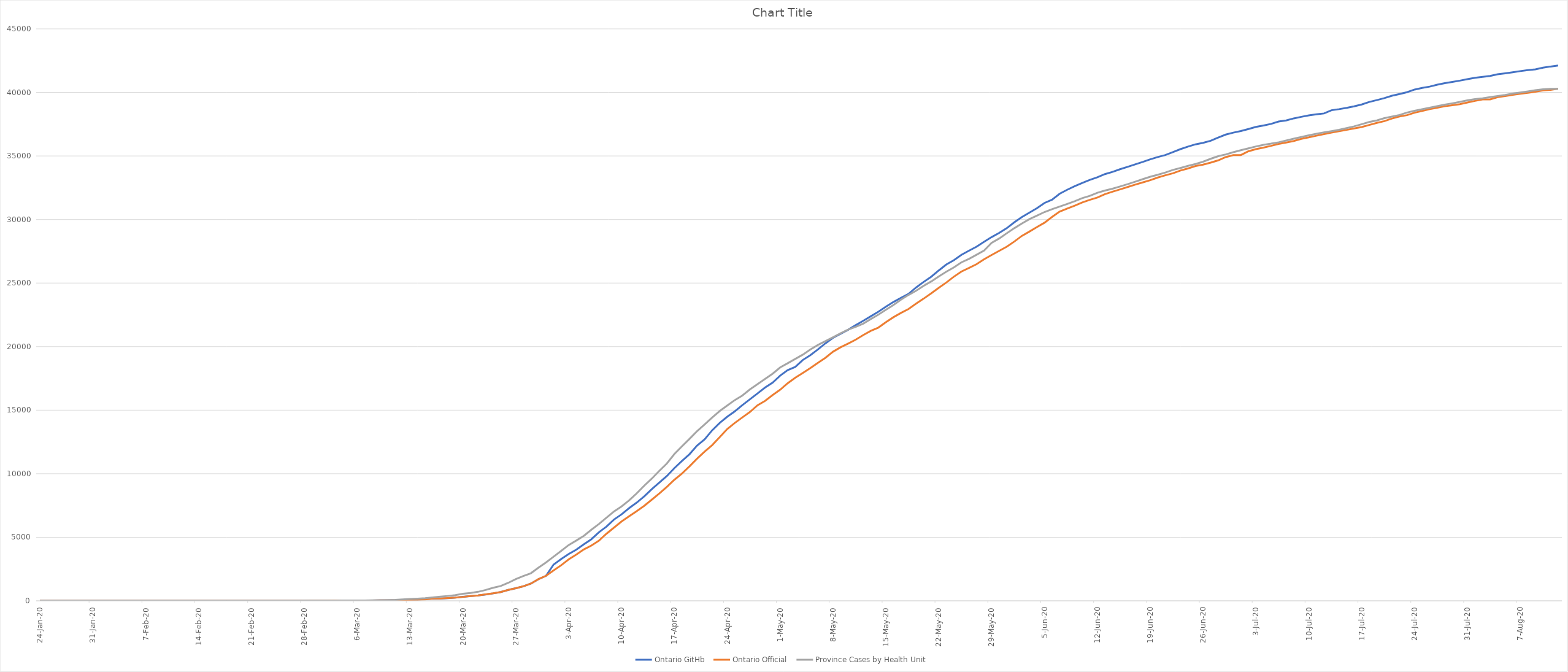
| Category | Ontario GitHb | Ontario Official | Province Cases by Health Unit |
|---|---|---|---|
| 2020-01-24 | 0 | 0 | 0 |
| 2020-01-25 | 0 | 0 | 0 |
| 2020-01-27 | 0 | 0 | 0 |
| 2020-01-28 | 0 | 0 | 0 |
| 2020-01-31 | 0 | 0 | 0 |
| 2020-02-04 | 0 | 0 | 0 |
| 2020-02-06 | 0 | 0 | 0 |
| 2020-02-14 | 0 | 0 | 0 |
| 2020-02-20 | 0 | 0 | 0 |
| 2020-02-21 | 0 | 0 | 1 |
| 2020-02-23 | 1 | 0 | 1 |
| 2020-02-24 | 1 | 4 | 1 |
| 2020-02-25 | 1 | 4 | 2 |
| 2020-02-26 | 2 | 4 | 3 |
| 2020-02-27 | 3 | 6 | 5 |
| 2020-02-28 | 5 | 6 | 10 |
| 2020-02-29 | 8 | 11 | 14 |
| 2020-03-01 | 12 | 15 | 16 |
| 2020-03-02 | 12 | 18 | 16 |
| 2020-03-03 | 17 | 20 | 18 |
| 2020-03-04 | 17 | 20 | 19 |
| 2020-03-05 | 19 | 22 | 23 |
| 2020-03-06 | 25 | 25 | 26 |
| 2020-03-07 | 25 | 28 | 29 |
| 2020-03-08 | 29 | 29 | 34 |
| 2020-03-09 | 32 | 34 | 40 |
| 2020-03-10 | 34 | 36 | 49 |
| 2020-03-11 | 39 | 41 | 71 |
| 2020-03-12 | 56 | 42 | 107 |
| 2020-03-13 | 76 | 74 | 143 |
| 2020-03-14 | 100 | 79 | 174 |
| 2020-03-15 | 142 | 104 | 210 |
| 2020-03-16 | 174 | 177 | 263 |
| 2020-03-17 | 186 | 185 | 321 |
| 2020-03-18 | 211 | 221 | 380 |
| 2020-03-19 | 255 | 257 | 449 |
| 2020-03-20 | 315 | 308 | 550 |
| 2020-03-21 | 374 | 377 | 620 |
| 2020-03-22 | 422 | 425 | 708 |
| 2020-03-23 | 500 | 503 | 853 |
| 2020-03-24 | 585 | 588 | 1027 |
| 2020-03-25 | 685 | 688 | 1164 |
| 2020-03-26 | 855 | 858 | 1413 |
| 2020-03-27 | 990 | 993 | 1709 |
| 2020-03-28 | 1141 | 1144 | 1945 |
| 2020-03-29 | 1352 | 1355 | 2170 |
| 2020-03-30 | 1703 | 1706 | 2609 |
| 2020-03-31 | 1963 | 1966 | 3019 |
| 2020-04-01 | 2848 | 2392 | 3472 |
| 2020-04-02 | 3285 | 2793 | 3921 |
| 2020-04-03 | 3683 | 3255 | 4386 |
| 2020-04-04 | 4018 | 3630 | 4738 |
| 2020-04-05 | 4438 | 4038 | 5110 |
| 2020-04-06 | 4842 | 4347 | 5589 |
| 2020-04-07 | 5388 | 4726 | 6044 |
| 2020-04-08 | 5835 | 5276 | 6538 |
| 2020-04-09 | 6394 | 5759 | 7028 |
| 2020-04-10 | 6801 | 6237 | 7425 |
| 2020-04-11 | 7290 | 6648 | 7901 |
| 2020-04-12 | 7723 | 7049 | 8448 |
| 2020-04-13 | 8217 | 7470 | 9053 |
| 2020-04-14 | 8777 | 7953 | 9610 |
| 2020-04-15 | 9299 | 8447 | 10225 |
| 2020-04-16 | 9818 | 8961 | 10804 |
| 2020-04-17 | 10444 | 9525 | 11554 |
| 2020-04-18 | 11005 | 10010 | 12158 |
| 2020-04-19 | 11536 | 10578 | 12744 |
| 2020-04-20 | 12211 | 11184 | 13350 |
| 2020-04-21 | 12703 | 11735 | 13876 |
| 2020-04-22 | 13415 | 12245 | 14417 |
| 2020-04-23 | 13992 | 12879 | 14932 |
| 2020-04-24 | 14482 | 13519 | 15363 |
| 2020-04-25 | 14910 | 13995 | 15793 |
| 2020-04-26 | 15397 | 14432 | 16155 |
| 2020-04-27 | 15853 | 14856 | 16634 |
| 2020-04-28 | 16311 | 15381 | 17045 |
| 2020-04-29 | 16774 | 15728 | 17453 |
| 2020-04-30 | 17165 | 16187 | 17868 |
| 2020-05-01 | 17717 | 16608 | 18357 |
| 2020-05-02 | 18155 | 17119 | 18690 |
| 2020-05-03 | 18398 | 17553 | 19032 |
| 2020-05-04 | 18947 | 17923 | 19366 |
| 2020-05-05 | 19327 | 18310 | 19770 |
| 2020-05-06 | 19776 | 18722 | 20126 |
| 2020-05-07 | 20257 | 19121 | 20430 |
| 2020-05-08 | 20687 | 19598 | 20731 |
| 2020-05-09 | 21007 | 19944 | 21044 |
| 2020-05-10 | 21322 | 20238 | 21336 |
| 2020-05-11 | 21684 | 20546 | 21550 |
| 2020-05-12 | 22028 | 20907 | 21808 |
| 2020-05-13 | 22385 | 21236 | 22167 |
| 2020-05-14 | 22744 | 21494 | 22509 |
| 2020-05-15 | 23137 | 21922 | 22895 |
| 2020-05-16 | 23510 | 22313 | 23270 |
| 2020-05-17 | 23840 | 22653 | 23690 |
| 2020-05-18 | 24148 | 22957 | 24066 |
| 2020-05-19 | 24650 | 23384 | 24392 |
| 2020-05-20 | 25089 | 23774 | 24782 |
| 2020-05-21 | 25493 | 24187 | 25123 |
| 2020-05-22 | 25990 | 24628 | 25522 |
| 2020-05-23 | 26460 | 25040 | 25889 |
| 2020-05-24 | 26798 | 25500 | 26229 |
| 2020-05-25 | 27217 | 25904 | 26628 |
| 2020-05-26 | 27543 | 26191 | 26902 |
| 2020-05-27 | 27861 | 26483 | 27227 |
| 2020-05-28 | 28244 | 26866 | 27553 |
| 2020-05-29 | 28615 | 27210 | 28158 |
| 2020-05-30 | 28942 | 27533 | 28504 |
| 2020-05-31 | 29314 | 27859 | 28915 |
| 2020-06-01 | 29778 | 28263 | 29314 |
| 2020-06-02 | 30191 | 28709 | 29680 |
| 2020-06-03 | 30543 | 29047 | 30026 |
| 2020-06-04 | 30886 | 29403 | 30308 |
| 2020-06-05 | 31302 | 29747 | 30587 |
| 2020-06-06 | 31553 | 30202 | 30809 |
| 2020-06-07 | 32026 | 30617 | 31013 |
| 2020-06-08 | 32338 | 30860 | 31225 |
| 2020-06-09 | 32617 | 31090 | 31441 |
| 2020-06-10 | 32876 | 31341 | 31678 |
| 2020-06-11 | 33113 | 31544 | 31863 |
| 2020-06-12 | 33325 | 31726 | 32103 |
| 2020-06-13 | 33571 | 31992 | 32275 |
| 2020-06-14 | 33746 | 32189 | 32420 |
| 2020-06-15 | 33953 | 32370 | 32599 |
| 2020-06-16 | 34143 | 32554 | 32775 |
| 2020-06-17 | 34339 | 32744 | 32972 |
| 2020-06-18 | 34527 | 32917 | 33171 |
| 2020-06-19 | 34736 | 33095 | 33363 |
| 2020-06-20 | 34917 | 33301 | 33521 |
| 2020-06-21 | 35074 | 33476 | 33697 |
| 2020-06-22 | 35298 | 33637 | 33899 |
| 2020-06-23 | 35536 | 33853 | 34051 |
| 2020-06-24 | 35737 | 34016 | 34219 |
| 2020-06-25 | 35915 | 34205 | 34363 |
| 2020-06-26 | 36030 | 34316 | 34546 |
| 2020-06-27 | 36194 | 34476 | 34775 |
| 2020-06-28 | 36446 | 34654 | 34983 |
| 2020-06-29 | 36684 | 34911 | 35118 |
| 2020-06-30 | 36835 | 35068 | 35292 |
| 2020-07-01 | 36959 | 35068 | 35451 |
| 2020-07-02 | 37118 | 35370 | 35596 |
| 2020-07-03 | 37283 | 35535 | 35749 |
| 2020-07-04 | 37399 | 35656 | 35878 |
| 2020-07-05 | 37523 | 35794 | 35967 |
| 2020-07-06 | 37707 | 35948 | 36073 |
| 2020-07-07 | 37791 | 36060 | 36211 |
| 2020-07-08 | 37955 | 36178 | 36354 |
| 2020-07-09 | 38076 | 36348 | 36488 |
| 2020-07-10 | 38195 | 36464 | 36620 |
| 2020-07-11 | 38276 | 36594 | 36744 |
| 2020-07-12 | 38342 | 36723 | 36857 |
| 2020-07-13 | 38598 | 36839 | 36953 |
| 2020-07-14 | 38681 | 36950 | 37056 |
| 2020-07-15 | 38785 | 37052 | 37190 |
| 2020-07-16 | 38906 | 37163 | 37327 |
| 2020-07-17 | 39049 | 37274 | 37497 |
| 2020-07-18 | 39248 | 37440 | 37670 |
| 2020-07-19 | 39395 | 37604 | 37796 |
| 2020-07-20 | 39549 | 37739 | 37975 |
| 2020-07-21 | 39736 | 37942 | 38099 |
| 2020-07-22 | 39872 | 38107 | 38222 |
| 2020-07-23 | 40015 | 38210 | 38414 |
| 2020-07-24 | 40223 | 38405 | 38552 |
| 2020-07-25 | 40351 | 38543 | 38671 |
| 2020-07-26 | 40455 | 38680 | 38793 |
| 2020-07-27 | 40605 | 38799 | 38914 |
| 2020-07-28 | 40730 | 38910 | 39039 |
| 2020-07-29 | 40823 | 38986 | 39139 |
| 2020-07-30 | 40925 | 39075 | 39250 |
| 2020-07-31 | 41043 | 39209 | 39376 |
| 2020-08-01 | 41152 | 39333 | 39475 |
| 2020-08-02 | 41226 | 39449 | 39535 |
| 2020-08-03 | 41296 | 39449 | 39632 |
| 2020-08-04 | 41422 | 39628 | 39719 |
| 2020-08-05 | 41497 | 39714 | 39803 |
| 2020-08-06 | 41583 | 39809 | 39905 |
| 2020-08-07 | 41674 | 39897 | 39988 |
| 2020-08-08 | 41751 | 39967 | 40077 |
| 2020-08-09 | 41810 | 40046 | 40170 |
| 2020-08-10 | 41945 | 40161 | 40241 |
| 2020-08-11 | 42036 | 40194 | 40286 |
| 2020-08-12 | 42111 | 40289 | 40286 |